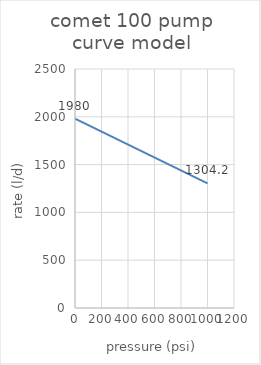
| Category | Series 0 |
|---|---|
| 0.0 | 1980 |
| 1000.0 | 1304.2 |